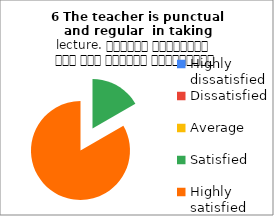
| Category | 6 The teacher is punctual and regular  in taking lecture. शिक्षक समयनिष्ठ हैं एवं नियमित व्याख्यान देते हैं |
|---|---|
| Highly dissatisfied | 0 |
| Dissatisfied | 0 |
| Average | 0 |
| Satisfied | 1 |
| Highly satisfied | 5 |